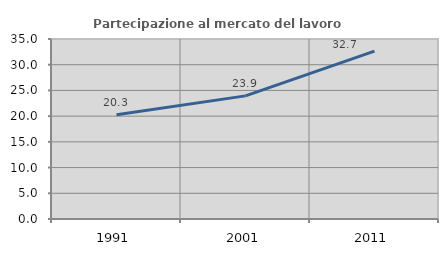
| Category | Partecipazione al mercato del lavoro  femminile |
|---|---|
| 1991.0 | 20.27 |
| 2001.0 | 23.944 |
| 2011.0 | 32.653 |